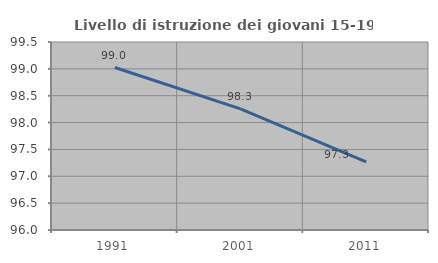
| Category | Livello di istruzione dei giovani 15-19 anni |
|---|---|
| 1991.0 | 99.024 |
| 2001.0 | 98.256 |
| 2011.0 | 97.268 |